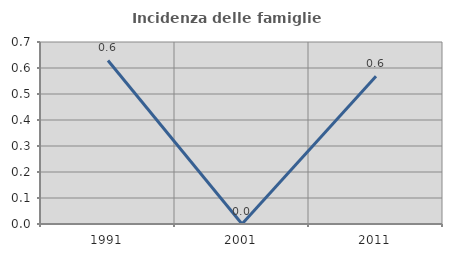
| Category | Incidenza delle famiglie numerose |
|---|---|
| 1991.0 | 0.629 |
| 2001.0 | 0 |
| 2011.0 | 0.568 |